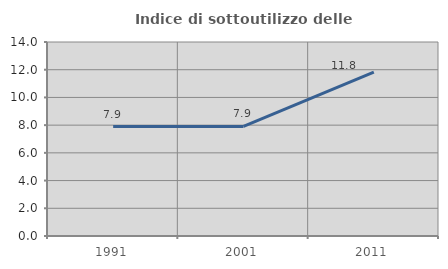
| Category | Indice di sottoutilizzo delle abitazioni  |
|---|---|
| 1991.0 | 7.894 |
| 2001.0 | 7.911 |
| 2011.0 | 11.821 |